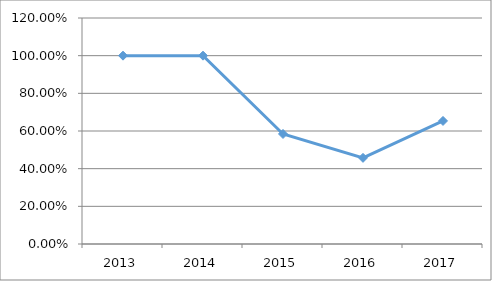
| Category | PRFA-M4O12 |
|---|---|
| 2013.0 | 1 |
| 2014.0 | 1 |
| 2015.0 | 0.584 |
| 2016.0 | 0.457 |
| 2017.0 | 0.653 |